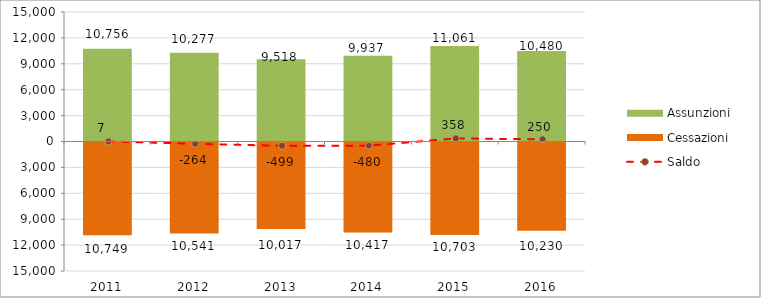
| Category | Assunzioni | Cessazioni |
|---|---|---|
| 2011.0 | 10756 | -10749 |
| 2012.0 | 10277 | -10541 |
| 2013.0 | 9518 | -10017 |
| 2014.0 | 9937 | -10417 |
| 2015.0 | 11061 | -10703 |
| 2016.0 | 10480 | -10230 |